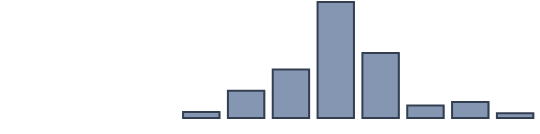
| Category | Series 0 |
|---|---|
| 0 | 0 |
| 1 | 0 |
| 2 | 0 |
| 3 | 0 |
| 4 | 2 |
| 5 | 9.2 |
| 6 | 16.4 |
| 7 | 39.3 |
| 8 | 22 |
| 9 | 4.2 |
| 10 | 5.4 |
| 11 | 1.6 |